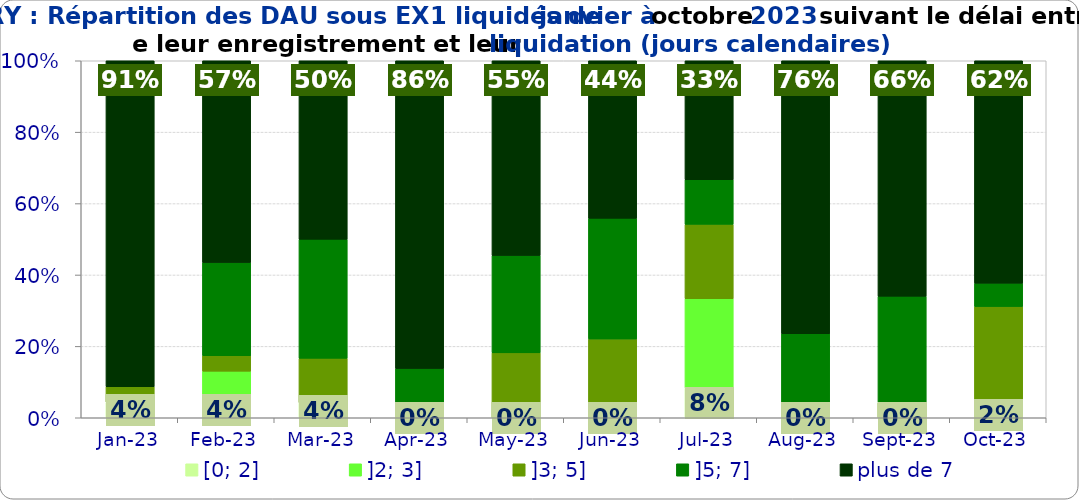
| Category | [0; 2] | ]2; 3] | ]3; 5] | ]5; 7] | plus de 7 |
|---|---|---|---|---|---|
| 2023-01-01 | 0.043 | 0 | 0.043 | 0 | 0.913 |
| 2023-02-01 | 0.043 | 0.087 | 0.043 | 0.261 | 0.565 |
| 2023-03-01 | 0.042 | 0 | 0.125 | 0.333 | 0.5 |
| 2023-04-01 | 0 | 0 | 0.034 | 0.103 | 0.862 |
| 2023-05-01 | 0 | 0 | 0.182 | 0.273 | 0.545 |
| 2023-06-01 | 0 | 0 | 0.221 | 0.338 | 0.441 |
| 2023-07-01 | 0.083 | 0.25 | 0.208 | 0.125 | 0.333 |
| 2023-08-01 | 0 | 0 | 0 | 0.235 | 0.765 |
| 2023-09-01 | 0 | 0 | 0.043 | 0.298 | 0.66 |
| 2023-10-01 | 0.016 | 0 | 0.295 | 0.066 | 0.623 |